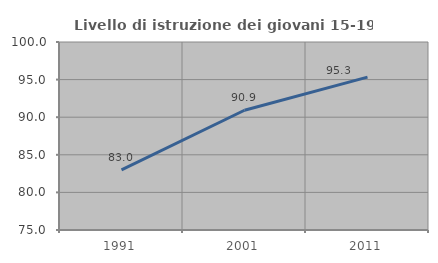
| Category | Livello di istruzione dei giovani 15-19 anni |
|---|---|
| 1991.0 | 82.995 |
| 2001.0 | 90.921 |
| 2011.0 | 95.334 |